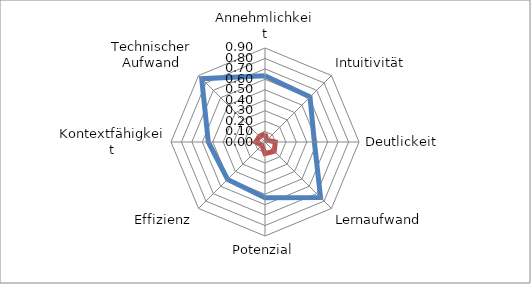
| Category | MOL3 | Series 1 |
|---|---|---|
| Annehmlichkeit | 0.634 | 0.079 |
| Intuitivität | 0.61 | 0.025 |
| Deutlickeit | 0.473 | 0.098 |
| Lernaufwand | 0.752 | 0.125 |
| Potenzial | 0.533 | 0.111 |
| Effizienz | 0.506 | 0.042 |
| Kontextfähigkeit | 0.543 | 0.09 |
| Technischer Aufwand | 0.857 | 0.071 |